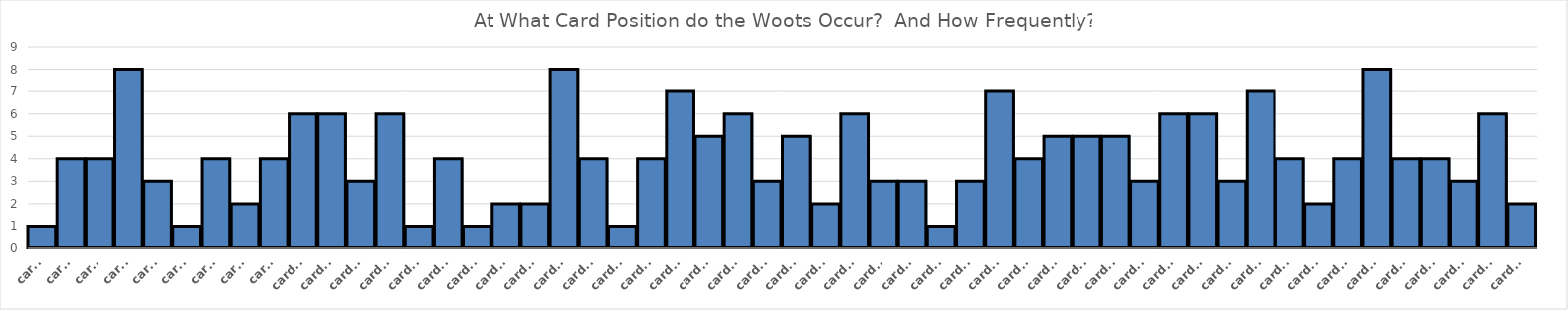
| Category | Series 0 |
|---|---|
| card1 | 1 |
| card2 | 4 |
| card3 | 4 |
| card4 | 8 |
| card5 | 3 |
| card6 | 1 |
| card7 | 4 |
| card8 | 2 |
| card9 | 4 |
| card10 | 6 |
| card11 | 6 |
| card12 | 3 |
| card13 | 6 |
| card14 | 1 |
| card15 | 4 |
| card16 | 1 |
| card17 | 2 |
| card18 | 2 |
| card19 | 8 |
| card20 | 4 |
| card21 | 1 |
| card22 | 4 |
| card23 | 7 |
| card24 | 5 |
| card25 | 6 |
| card26 | 3 |
| card27 | 5 |
| card28 | 2 |
| card29 | 6 |
| card30 | 3 |
| card31 | 3 |
| card32 | 1 |
| card33 | 3 |
| card34 | 7 |
| card35 | 4 |
| card36 | 5 |
| card37 | 5 |
| card38 | 5 |
| card39 | 3 |
| card40 | 6 |
| card41 | 6 |
| card42 | 3 |
| card43 | 7 |
| card44 | 4 |
| card45 | 2 |
| card46 | 4 |
| card47 | 8 |
| card48 | 4 |
| card49 | 4 |
| card50 | 3 |
| card51 | 6 |
| card52 | 2 |